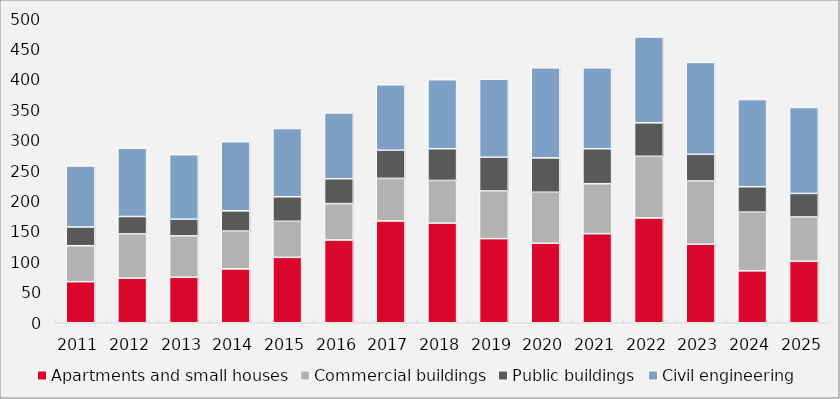
| Category | Apartments and small houses | Commercial buildings | Public buildings | Civil engineering |
|---|---|---|---|---|
| 2011.0 | 67.55 | 59.136 | 30.84 | 100.42 |
| 2012.0 | 73.399 | 72.657 | 28.674 | 112.4 |
| 2013.0 | 74.747 | 68.126 | 27.416 | 106.158 |
| 2014.0 | 88.597 | 62.131 | 33.327 | 113.788 |
| 2015.0 | 107.573 | 59.312 | 40.373 | 112.147 |
| 2016.0 | 136.112 | 59.903 | 40.894 | 108.156 |
| 2017.0 | 167.497 | 69.96 | 46.283 | 107.666 |
| 2018.0 | 163.85 | 70.229 | 52.161 | 113.505 |
| 2019.0 | 138.371 | 78.398 | 55.421 | 128.39 |
| 2020.0 | 130.741 | 83.922 | 56.487 | 148.136 |
| 2021.0 | 146.538 | 82.124 | 57.59 | 133.121 |
| 2022.0 | 172.404 | 101.34 | 55.086 | 141.219 |
| 2023.0 | 129.066 | 104.098 | 43.922 | 151.153 |
| 2024.0 | 85.433 | 96.439 | 41.877 | 143.346 |
| 2025.0 | 101.053 | 72.879 | 38.76 | 141.354 |